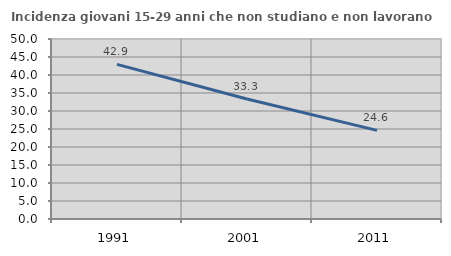
| Category | Incidenza giovani 15-29 anni che non studiano e non lavorano  |
|---|---|
| 1991.0 | 42.941 |
| 2001.0 | 33.333 |
| 2011.0 | 24.616 |